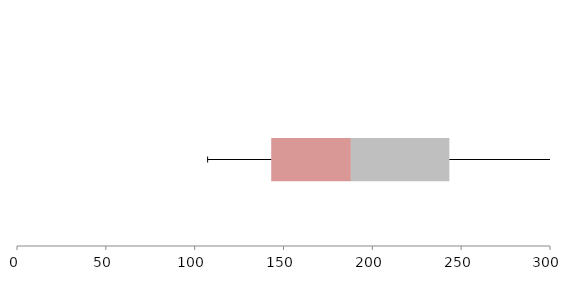
| Category | Series 1 | Series 2 | Series 3 |
|---|---|---|---|
| 0 | 143.091 | 44.842 | 55.427 |